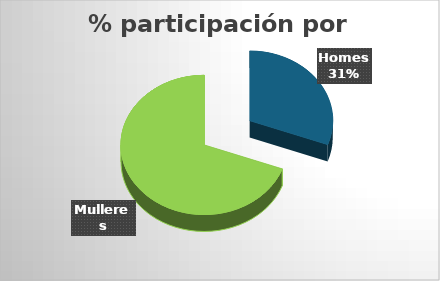
| Category | Series 0 |
|---|---|
| Homes | 26 |
| Mulleres | 59 |